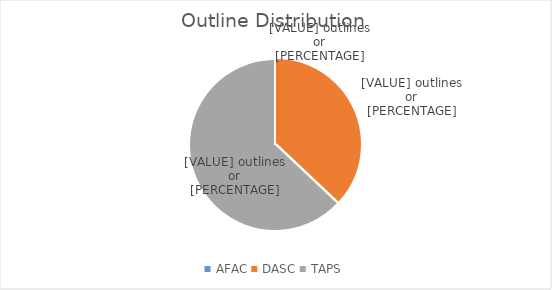
| Category | Series 0 |
|---|---|
| AFAC | 0 |
| DASC | 10 |
| TAPS | 17 |